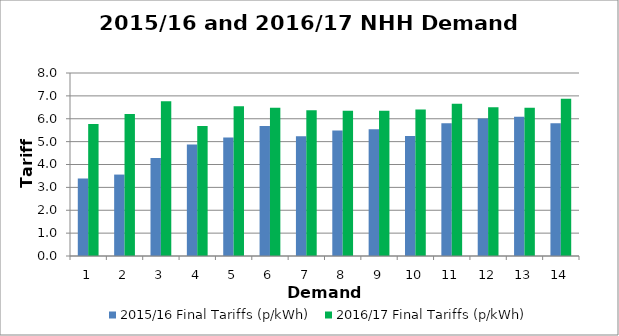
| Category | 2015/16 Final Tariffs (p/kWh) | 2016/17 Final Tariffs (p/kWh) |
|---|---|---|
| 0 | 3.389 | 5.768 |
| 1 | 3.56 | 6.207 |
| 2 | 4.284 | 6.766 |
| 3 | 4.875 | 5.688 |
| 4 | 5.185 | 6.543 |
| 5 | 5.679 | 6.479 |
| 6 | 5.235 | 6.375 |
| 7 | 5.487 | 6.354 |
| 8 | 5.54 | 6.353 |
| 9 | 5.246 | 6.403 |
| 10 | 5.808 | 6.653 |
| 11 | 6.011 | 6.508 |
| 12 | 6.088 | 6.485 |
| 13 | 5.807 | 6.878 |